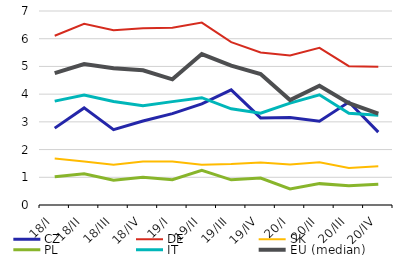
| Category | CZ | DE | SK | PL | IT | EU (median) |
|---|---|---|---|---|---|---|
| 18/I | 2.774 | 6.105 | 1.68 | 1.016 | 3.747 | 4.757 |
| 18/II | 3.503 | 6.539 | 1.574 | 1.129 | 3.966 | 5.084 |
| 18/III | 2.717 | 6.304 | 1.448 | 0.891 | 3.736 | 4.931 |
| 18/IV | 3.03 | 6.378 | 1.568 | 1 | 3.583 | 4.86 |
| 19/I | 3.298 | 6.399 | 1.573 | 0.911 | 3.73 | 4.534 |
| 19/II | 3.65 | 6.583 | 1.453 | 1.256 | 3.873 | 5.447 |
| 19/III | 4.155 | 5.879 | 1.476 | 0.908 | 3.47 | 5.029 |
| 19/IV | 3.143 | 5.505 | 1.53 | 0.973 | 3.31 | 4.724 |
| 20/I | 3.158 | 5.397 | 1.461 | 0.579 | 3.675 | 3.786 |
| 20/II | 3.021 | 5.669 | 1.545 | 0.771 | 3.976 | 4.302 |
| 20/III | 3.714 | 5.009 | 1.339 | 0.697 | 3.313 | 3.671 |
| 20/IV | 2.63 | 4.992 | 1.398 | 0.75 | 3.243 | 3.293 |